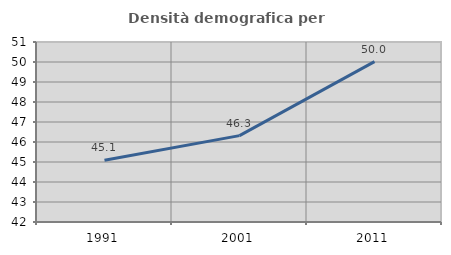
| Category | Densità demografica |
|---|---|
| 1991.0 | 45.092 |
| 2001.0 | 46.319 |
| 2011.0 | 50.02 |